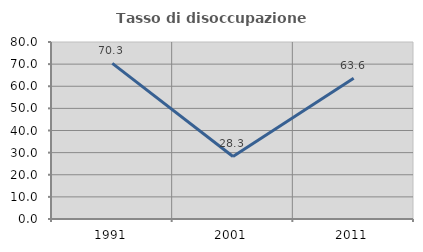
| Category | Tasso di disoccupazione giovanile  |
|---|---|
| 1991.0 | 70.312 |
| 2001.0 | 28.261 |
| 2011.0 | 63.636 |